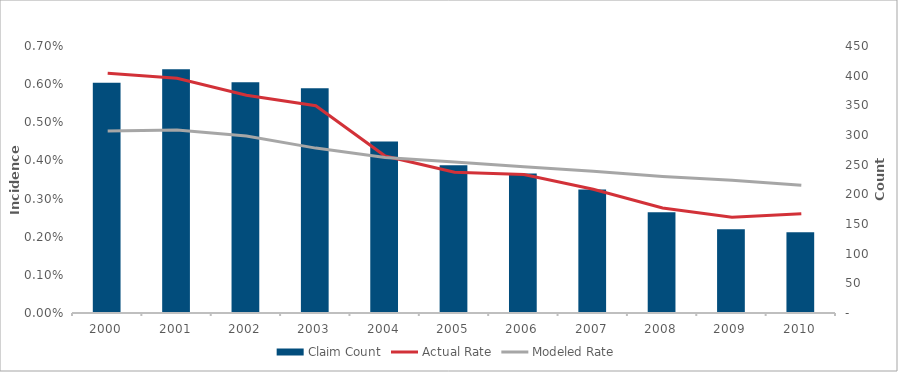
| Category | Claim Count |
|---|---|
| 2000.0 | 388 |
| 2001.0 | 411 |
| 2002.0 | 389 |
| 2003.0 | 379 |
| 2004.0 | 289 |
| 2005.0 | 249 |
| 2006.0 | 235 |
| 2007.0 | 208 |
| 2008.0 | 170 |
| 2009.0 | 141 |
| 2010.0 | 136 |